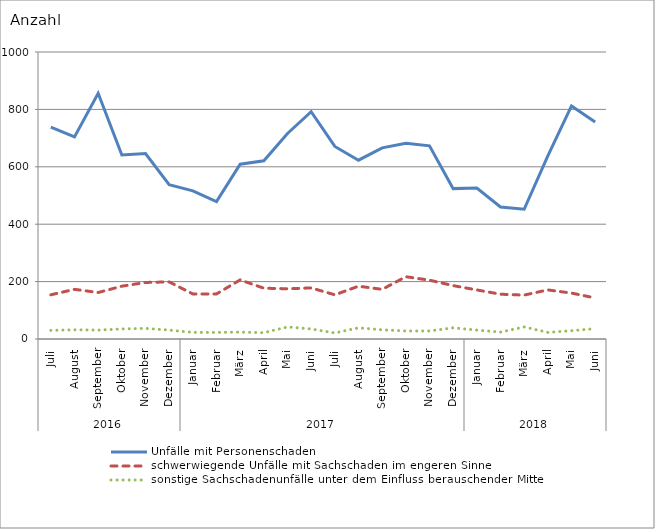
| Category | Unfälle mit Personenschaden | schwerwiegende Unfälle mit Sachschaden im engeren Sinne | sonstige Sachschadenunfälle unter dem Einfluss berauschender Mittel |
|---|---|---|---|
| 0 | 738 | 154 | 30 |
| 1 | 704 | 173 | 32 |
| 2 | 856 | 162 | 31 |
| 3 | 641 | 184 | 35 |
| 4 | 646 | 197 | 37 |
| 5 | 538 | 199 | 31 |
| 6 | 516 | 157 | 23 |
| 7 | 479 | 157 | 23 |
| 8 | 609 | 206 | 24 |
| 9 | 621 | 177 | 22 |
| 10 | 716 | 175 | 42 |
| 11 | 792 | 178 | 35 |
| 12 | 671 | 154 | 21 |
| 13 | 623 | 184 | 39 |
| 14 | 666 | 173 | 32 |
| 15 | 682 | 217 | 28 |
| 16 | 673 | 205 | 28 |
| 17 | 524 | 186 | 39 |
| 18 | 526 | 171 | 31 |
| 19 | 460 | 156 | 24 |
| 20 | 452 | 153 | 42 |
| 21 | 638 | 171 | 23 |
| 22 | 812 | 160 | 29 |
| 23 | 756 | 143 | 36 |